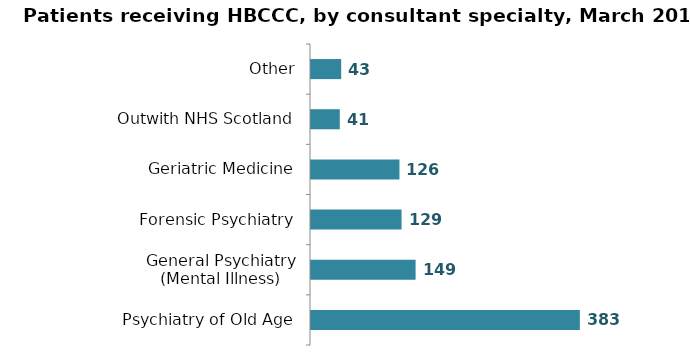
| Category | Series 0 |
|---|---|
| Psychiatry of Old Age | 383 |
| General Psychiatry (Mental Illness) | 149 |
| Forensic Psychiatry | 129 |
| Geriatric Medicine | 126 |
| Outwith NHS Scotland | 41 |
| Other | 43 |